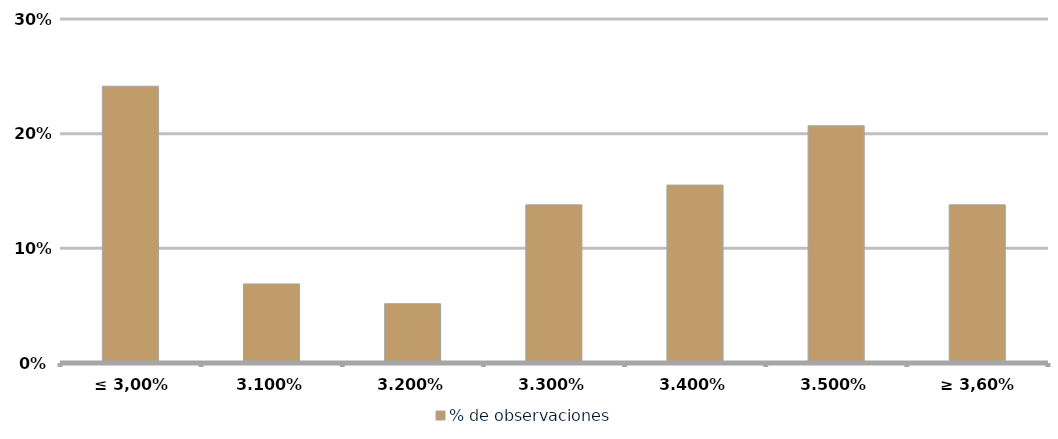
| Category | % de observaciones  |
|---|---|
| ≤ 3,00% | 0.241 |
| 3.10% | 0.069 |
| 3.20% | 0.052 |
| 3.30% | 0.138 |
| 3.40% | 0.155 |
| 3.50% | 0.207 |
| ≥ 3,60% | 0.138 |